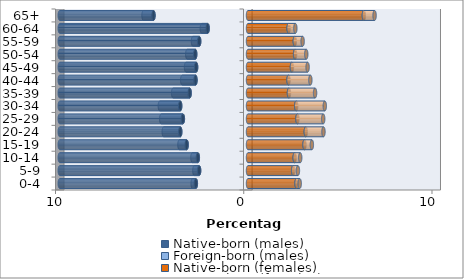
| Category | Native-born (males) | Foreign-born (males) | Native-born (females) | Foreign-born (females) |
|---|---|---|---|---|
| 0-4 | -2.77 | -0.171 | 2.578 | 0.17 |
| 5-9 | -2.597 | -0.253 | 2.398 | 0.254 |
| 10-14 | -2.664 | -0.289 | 2.48 | 0.294 |
| 15-19 | -3.259 | -0.383 | 3.001 | 0.391 |
| 20-24 | -3.598 | -0.878 | 3.07 | 0.94 |
| 25-29 | -3.46 | -1.149 | 2.626 | 1.369 |
| 30-34 | -3.602 | -1.081 | 2.561 | 1.519 |
| 35-39 | -3.1 | -0.877 | 2.176 | 1.388 |
| 40-44 | -2.789 | -0.704 | 2.152 | 1.161 |
| 45-49 | -2.756 | -0.536 | 2.334 | 0.832 |
| 50-54 | -2.803 | -0.424 | 2.501 | 0.594 |
| 55-59 | -2.593 | -0.33 | 2.486 | 0.416 |
| 60-64 | -2.145 | -0.308 | 2.157 | 0.358 |
| 65+ | -5.021 | -0.529 | 6.155 | 0.57 |